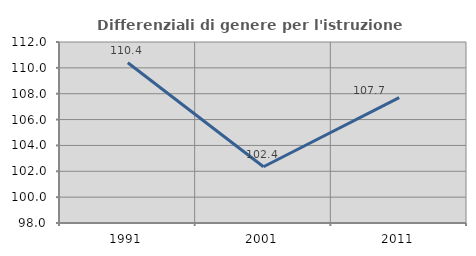
| Category | Differenziali di genere per l'istruzione superiore |
|---|---|
| 1991.0 | 110.399 |
| 2001.0 | 102.353 |
| 2011.0 | 107.692 |